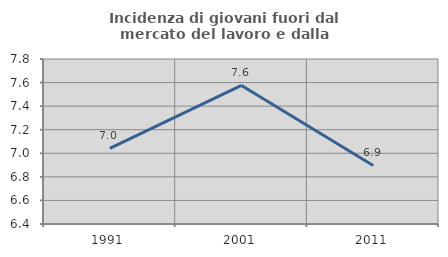
| Category | Incidenza di giovani fuori dal mercato del lavoro e dalla formazione  |
|---|---|
| 1991.0 | 7.042 |
| 2001.0 | 7.576 |
| 2011.0 | 6.897 |